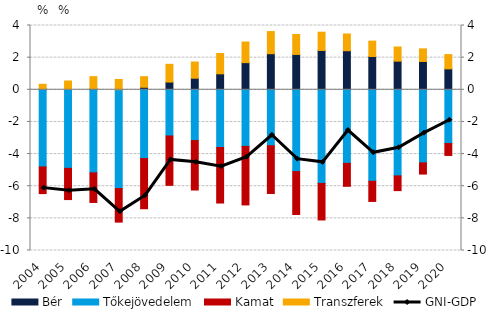
| Category | Bér | Tőkejövedelem | Kamat | Transzferek |
|---|---|---|---|---|
| 2004.0 | 0.05 | -4.8 | -1.66 | 0.291 |
| 2005.0 | 0.026 | -4.888 | -1.943 | 0.52 |
| 2006.0 | 0.074 | -5.169 | -1.842 | 0.743 |
| 2007.0 | 0.004 | -6.146 | -2.089 | 0.638 |
| 2008.0 | 0.158 | -4.278 | -3.124 | 0.657 |
| 2009.0 | 0.48 | -2.874 | -3.072 | 1.104 |
| 2010.0 | 0.721 | -3.16 | -3.076 | 1.006 |
| 2011.0 | 0.993 | -3.59 | -3.455 | 1.264 |
| 2012.0 | 1.689 | -3.522 | -3.642 | 1.282 |
| 2013.0 | 2.245 | -3.481 | -2.972 | 1.377 |
| 2014.0 | 2.199 | -5.091 | -2.669 | 1.243 |
| 2015.0 | 2.447 | -5.826 | -2.273 | 1.137 |
| 2016.0 | 2.431 | -4.577 | -1.429 | 1.041 |
| 2017.0 | 2.071 | -5.694 | -1.253 | 0.958 |
| 2018.0 | 1.782 | -5.357 | -0.917 | 0.881 |
| 2019.0 | 1.762 | -4.546 | -0.698 | 0.785 |
| 2020.0 | 1.302 | -3.345 | -0.739 | 0.888 |